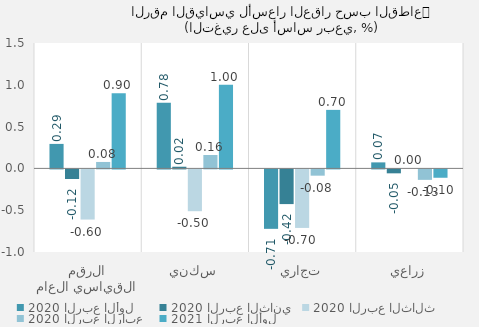
| Category | 2020 | 2021 |
|---|---|---|
| الرقم القياسي العام | 0.077 | 0.9 |
| سكني | 0.16 | 1 |
| تجاري | -0.075 | 0.7 |
| زراعي | -0.125 | -0.1 |